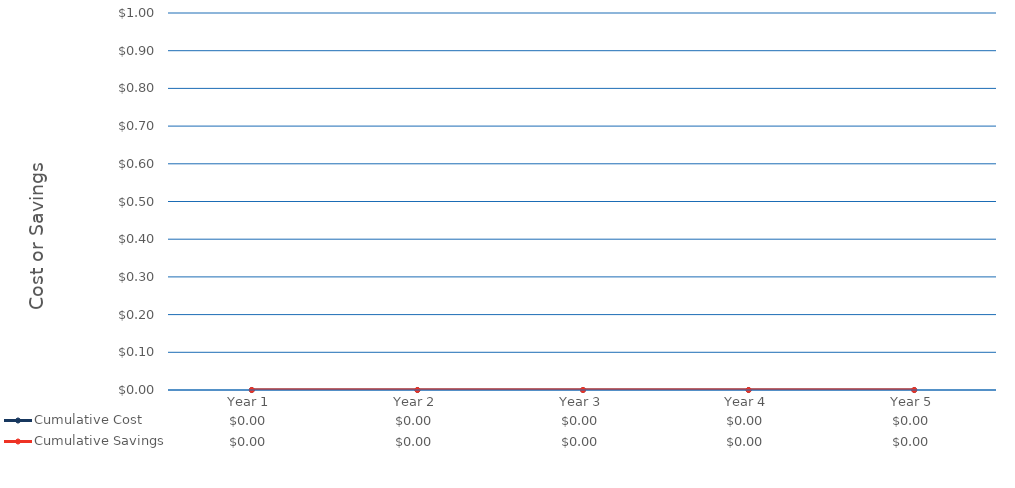
| Category | Cumulative Cost | Cumulative Savings |
|---|---|---|
| Year 1 | 0 | 0 |
| Year 2 | 0 | 0 |
| Year 3 | 0 | 0 |
| Year 4 | 0 | 0 |
| Year 5 | 0 | 0 |